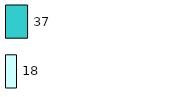
| Category | Series 0 | Series 1 |
|---|---|---|
| 0 | 18 | 37 |